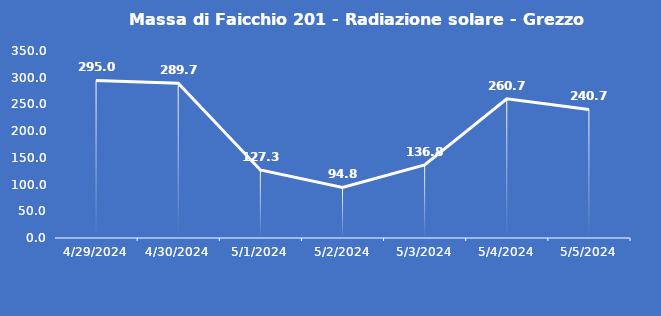
| Category | Massa di Faicchio 201 - Radiazione solare - Grezzo (W/m2) |
|---|---|
| 4/29/24 | 295 |
| 4/30/24 | 289.7 |
| 5/1/24 | 127.3 |
| 5/2/24 | 94.8 |
| 5/3/24 | 136.8 |
| 5/4/24 | 260.7 |
| 5/5/24 | 240.7 |